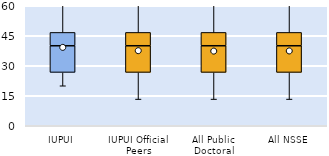
| Category | 25th | 50th | 75th |
|---|---|---|---|
| IUPUI | 26.667 | 13.333 | 6.667 |
| IUPUI Official Peers | 26.667 | 13.333 | 6.667 |
| All Public Doctoral | 26.667 | 13.333 | 6.667 |
| All NSSE | 26.667 | 13.333 | 6.667 |